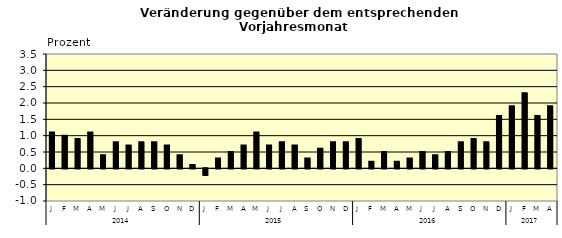
| Category | Series 0 |
|---|---|
| 0 | 1.1 |
| 1 | 1 |
| 2 | 0.9 |
| 3 | 1.1 |
| 4 | 0.4 |
| 5 | 0.8 |
| 6 | 0.7 |
| 7 | 0.8 |
| 8 | 0.8 |
| 9 | 0.7 |
| 10 | 0.4 |
| 11 | 0.1 |
| 12 | -0.2 |
| 13 | 0.3 |
| 14 | 0.5 |
| 15 | 0.7 |
| 16 | 1.1 |
| 17 | 0.7 |
| 18 | 0.8 |
| 19 | 0.7 |
| 20 | 0.3 |
| 21 | 0.6 |
| 22 | 0.8 |
| 23 | 0.8 |
| 24 | 0.9 |
| 25 | 0.2 |
| 26 | 0.5 |
| 27 | 0.2 |
| 28 | 0.3 |
| 29 | 0.5 |
| 30 | 0.4 |
| 31 | 0.5 |
| 32 | 0.8 |
| 33 | 0.9 |
| 34 | 0.8 |
| 35 | 1.6 |
| 36 | 1.9 |
| 37 | 2.3 |
| 38 | 1.6 |
| 39 | 1.9 |